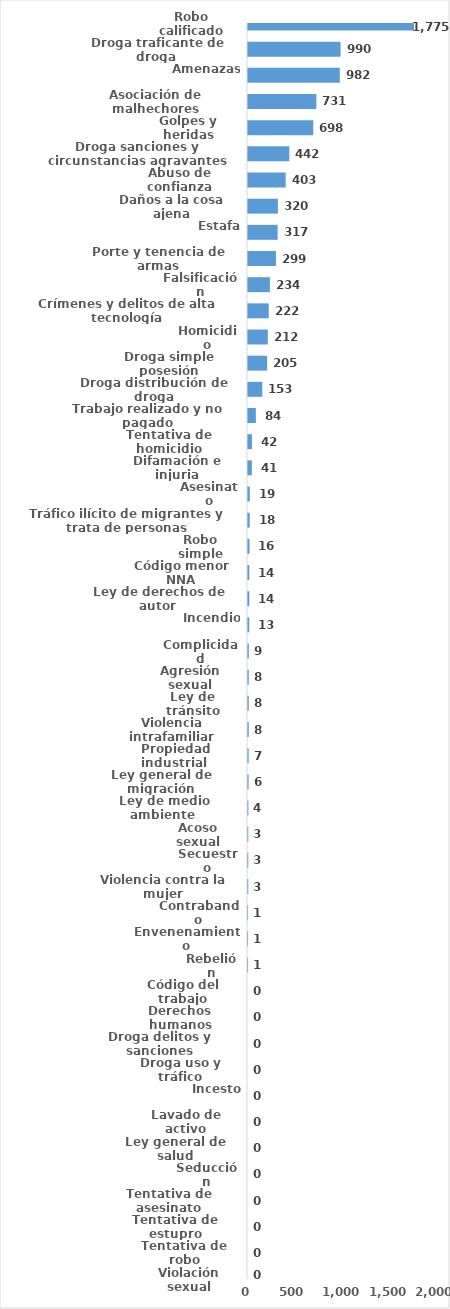
| Category | Series 0 |
|---|---|
| Robo calificado | 1775 |
| Droga traficante de droga  | 990 |
| Amenazas | 982 |
| Asociación de malhechores | 731 |
| Golpes y heridas | 698 |
| Droga sanciones y circunstancias agravantes | 442 |
| Abuso de confianza | 403 |
| Daños a la cosa ajena | 320 |
| Estafa | 317 |
| Porte y tenencia de armas | 299 |
| Falsificación | 234 |
| Crímenes y delitos de alta tecnología | 222 |
| Homicidio | 212 |
| Droga simple posesión | 205 |
| Droga distribución de droga | 153 |
| Trabajo realizado y no pagado | 84 |
| Tentativa de homicidio | 42 |
| Difamación e injuria | 41 |
| Asesinato | 19 |
| Tráfico ilícito de migrantes y trata de personas | 18 |
| Robo simple | 16 |
| Código menor NNA | 14 |
| Ley de derechos de autor  | 14 |
| Incendio | 13 |
| Complicidad | 9 |
| Agresión sexual | 8 |
| Ley de tránsito | 8 |
| Violencia intrafamiliar | 8 |
| Propiedad industrial  | 7 |
| Ley general de migración | 6 |
| Ley de medio ambiente  | 4 |
| Acoso sexual | 3 |
| Secuestro | 3 |
| Violencia contra la mujer | 3 |
| Contrabando | 1 |
| Envenenamiento | 1 |
| Rebelión | 1 |
| Código del trabajo | 0 |
| Derechos humanos | 0 |
| Droga delitos y sanciones | 0 |
| Droga uso y tráfico | 0 |
| Incesto | 0 |
| Lavado de activo | 0 |
| Ley general de salud | 0 |
| Seducción | 0 |
| Tentativa de asesinato | 0 |
| Tentativa de estupro | 0 |
| Tentativa de robo | 0 |
| Violación sexual | 0 |